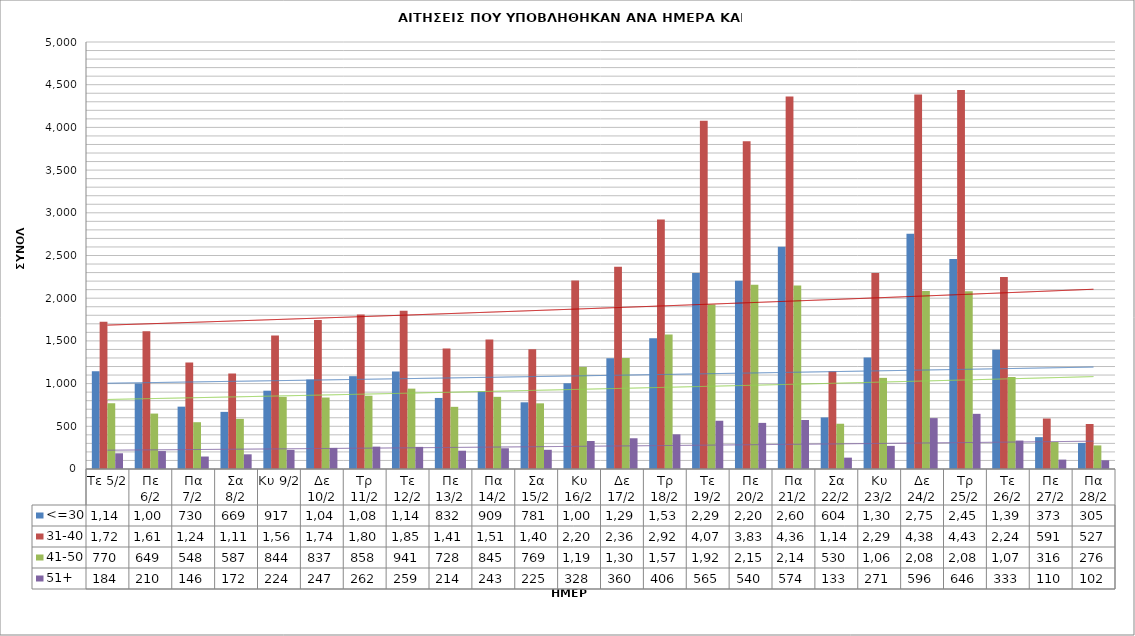
| Category | <=30 | 31-40 | 41-50 | 51+ |
|---|---|---|---|---|
| Τε 5/2 | 1146 | 1724 | 770 | 184 |
| Πε 6/2 | 1001 | 1612 | 649 | 210 |
| Πα 7/2 | 730 | 1246 | 548 | 146 |
| Σα 8/2 | 669 | 1117 | 587 | 172 |
| Κυ 9/2 | 917 | 1564 | 844 | 224 |
| Δε 10/2 | 1049 | 1745 | 837 | 247 |
| Τρ 11/2 | 1087 | 1809 | 858 | 262 |
| Τε 12/2 | 1142 | 1853 | 941 | 259 |
| Πε 13/2 | 832 | 1410 | 728 | 214 |
| Πα 14/2 | 909 | 1515 | 845 | 243 |
| Σα 15/2 | 781 | 1402 | 769 | 225 |
| Κυ 16/2 | 1003 | 2207 | 1195 | 328 |
| Δε 17/2 | 1298 | 2368 | 1301 | 360 |
| Τρ 18/2 | 1532 | 2921 | 1575 | 406 |
| Τε 19/2 | 2296 | 4077 | 1925 | 565 |
| Πε 20/2 | 2203 | 3837 | 2157 | 540 |
| Πα 21/2 | 2603 | 4361 | 2148 | 574 |
| Σα 22/2 | 604 | 1146 | 530 | 133 |
| Κυ 23/2 | 1306 | 2296 | 1067 | 271 |
| Δε 24/2 | 2755 | 4385 | 2083 | 596 |
| Τρ 25/2 | 2458 | 4437 | 2082 | 646 |
| Τε 26/2 | 1395 | 2248 | 1078 | 333 |
| Πε 27/2 | 373 | 591 | 316 | 110 |
| Πα 28/2 | 305 | 527 | 276 | 102 |